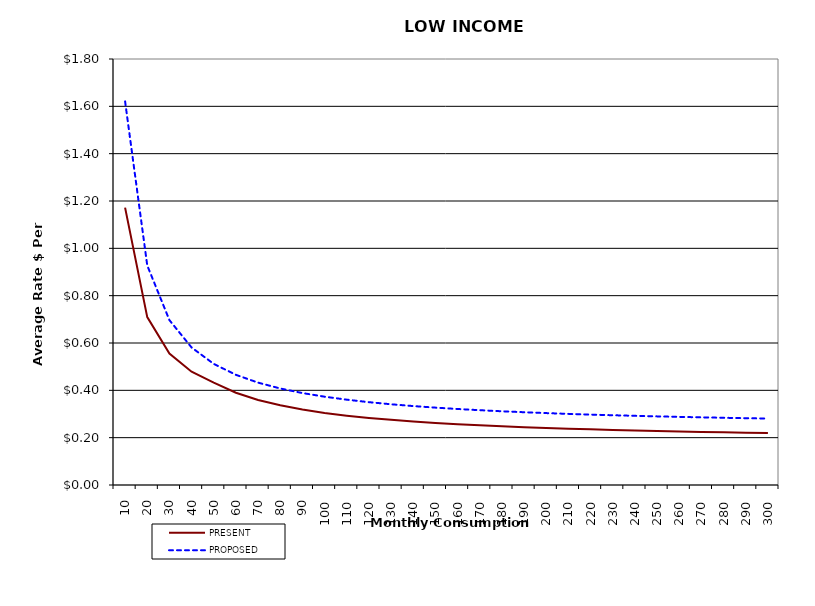
| Category | PRESENT | PROPOSED |
|---|---|---|
| 10.0 | 1.172 | 1.621 |
| 20.0 | 0.71 | 0.928 |
| 30.0 | 0.556 | 0.697 |
| 40.0 | 0.479 | 0.581 |
| 50.0 | 0.432 | 0.512 |
| 60.0 | 0.39 | 0.465 |
| 70.0 | 0.359 | 0.433 |
| 80.0 | 0.337 | 0.408 |
| 90.0 | 0.319 | 0.389 |
| 100.0 | 0.305 | 0.373 |
| 110.0 | 0.293 | 0.361 |
| 120.0 | 0.283 | 0.35 |
| 130.0 | 0.275 | 0.341 |
| 140.0 | 0.268 | 0.333 |
| 150.0 | 0.262 | 0.327 |
| 160.0 | 0.257 | 0.321 |
| 170.0 | 0.252 | 0.316 |
| 180.0 | 0.248 | 0.312 |
| 190.0 | 0.244 | 0.307 |
| 200.0 | 0.241 | 0.304 |
| 210.0 | 0.238 | 0.301 |
| 220.0 | 0.235 | 0.298 |
| 230.0 | 0.233 | 0.295 |
| 240.0 | 0.23 | 0.292 |
| 250.0 | 0.228 | 0.29 |
| 260.0 | 0.226 | 0.288 |
| 270.0 | 0.224 | 0.286 |
| 280.0 | 0.223 | 0.284 |
| 290.0 | 0.221 | 0.282 |
| 300.0 | 0.22 | 0.281 |